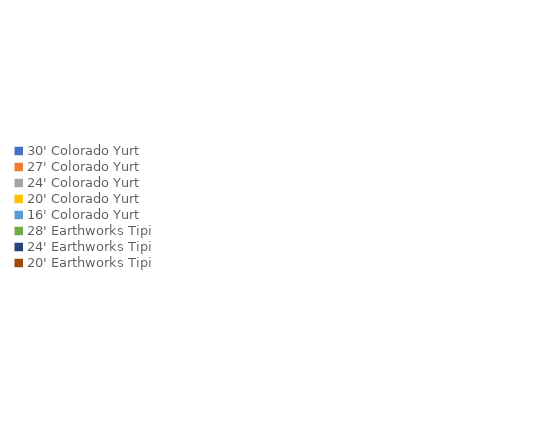
| Category | Series 0 | Series 1 |
|---|---|---|
| 30' Colorado Yurt | 0 | 0 |
| 27' Colorado Yurt | 0 | 0 |
| 24' Colorado Yurt | 0 | 0 |
| 20' Colorado Yurt | 0 | 0 |
| 16' Colorado Yurt | 0 | 0 |
| 28' Earthworks Tipi | 0 | 0 |
| 24' Earthworks Tipi | 0 | 0 |
| 20' Earthworks Tipi | 0 | 0 |